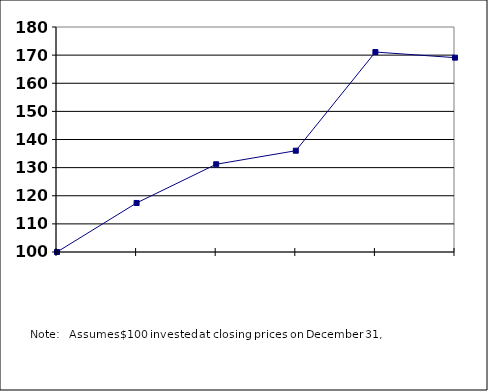
| Category |  100.00  |
|---|---|
| nan | 100 |
| 2016.0 | 117.436 |
| 2017.0 | 131.195 |
| 2018.0 | 136.015 |
| 2019.0 | 171.092 |
| 2020.0 | 169.102 |